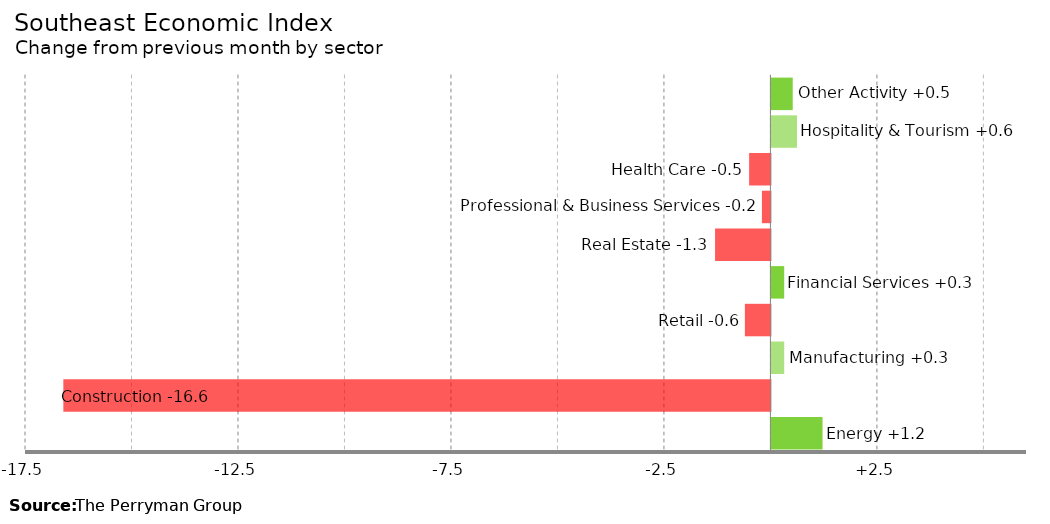
| Category | Change |
|---|---|
| Energy | 1.2 |
| Construction | -16.6 |
| Manufacturing | 0.3 |
| Retail | -0.6 |
| Financial Services | 0.3 |
| Real Estate | -1.3 |
| Professional & Business Services | -0.2 |
| Health Care | -0.5 |
| Hospitality & Tourism | 0.6 |
| Other Activity | 0.5 |